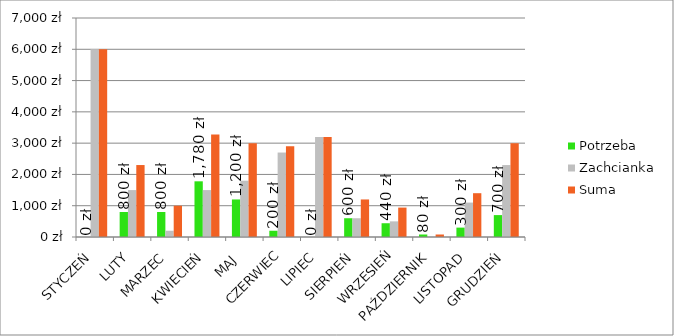
| Category | Potrzeba | Zachcianka | Suma |
|---|---|---|---|
| STYCZEŃ | 0 | 6000 | 6000 |
| LUTY | 800 | 1500 | 2300 |
| MARZEC | 800 | 200 | 1000 |
| KWIECIEŃ | 1780 | 1500 | 3280 |
| MAJ  | 1200 | 1800 | 3000 |
| CZERWIEC | 200 | 2700 | 2900 |
| LIPIEC | 0 | 3200 | 3200 |
| SIERPIEŃ | 600 | 600 | 1200 |
| WRZESIEŃ | 440 | 500 | 940 |
| PAŹDZIERNIK | 80 | 0 | 80 |
| LISTOPAD | 300 | 1100 | 1400 |
| GRUDZIEŃ | 700 | 2300 | 3000 |